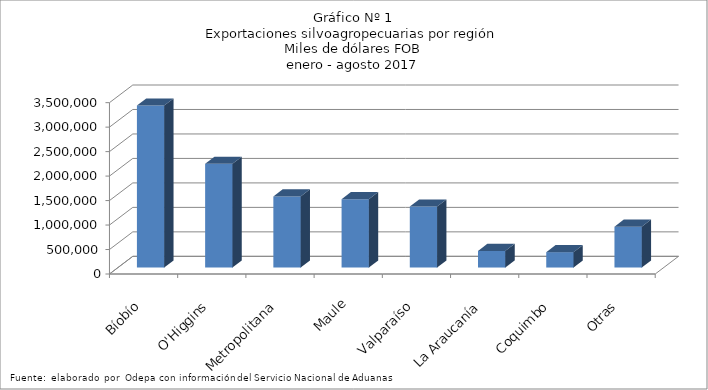
| Category | Series 0 |
|---|---|
| Bíobío | 3311056.097 |
| O'Higgins | 2121150.498 |
| Metropolitana | 1453077.113 |
| Maule | 1396225.153 |
| Valparaíso | 1246197.898 |
| La Araucanía | 339276.201 |
| Coquimbo | 314243.287 |
| Otras | 834952.741 |